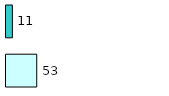
| Category | Series 0 | Series 1 |
|---|---|---|
| 0 | 53 | 11 |